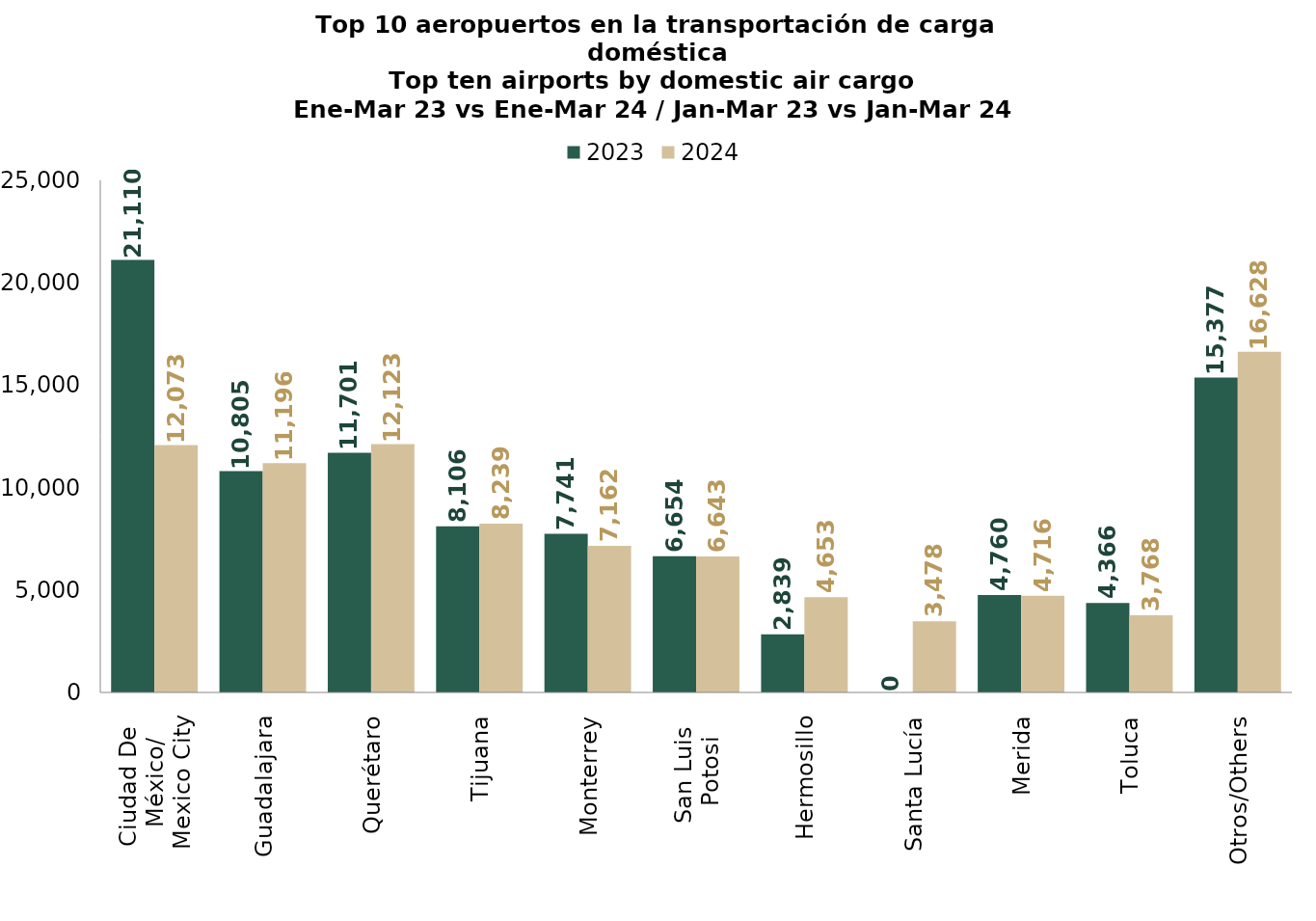
| Category | 2023 | 2024 |
|---|---|---|
| Ciudad De 
México/
Mexico City | 21110.14 | 12073 |
| Guadalajara | 10804.693 | 11195.611 |
| Querétaro | 11700.63 | 12123.293 |
| Tijuana | 8105.697 | 8238.713 |
| Monterrey | 7741.075 | 7161.795 |
| San Luis 
Potosi | 6654.031 | 6643.247 |
| Hermosillo | 2838.947 | 4653.46 |
| Santa Lucía | 0 | 3477.903 |
| Merida | 4760.172 | 4716.344 |
| Toluca | 4366.093 | 3767.778 |
| Otros/Others | 15377.181 | 16628.484 |